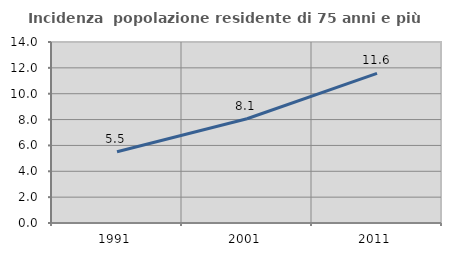
| Category | Incidenza  popolazione residente di 75 anni e più |
|---|---|
| 1991.0 | 5.513 |
| 2001.0 | 8.061 |
| 2011.0 | 11.57 |